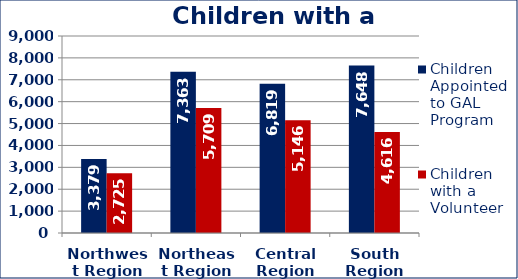
| Category | Children Appointed to GAL Program  | Children with a Volunteer  |
|---|---|---|
| Northwest Region | 3379 | 2725 |
| Northeast Region | 7363 | 5709 |
| Central Region | 6819 | 5146 |
| South Region | 7648 | 4616 |